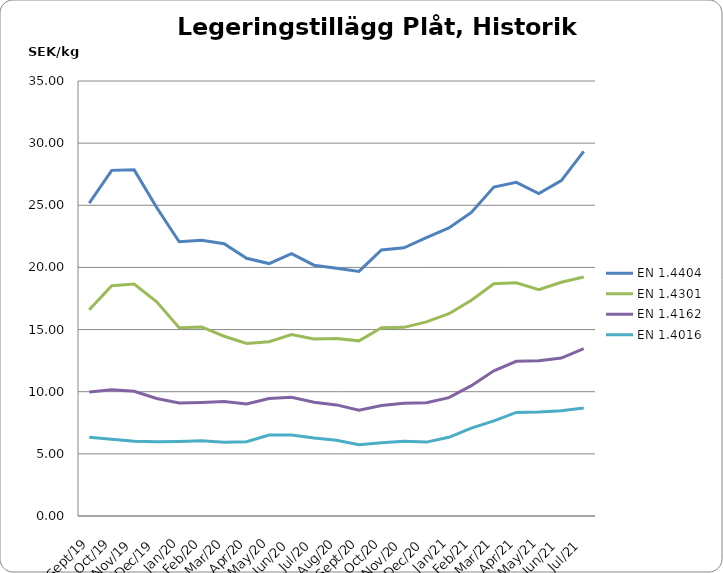
| Category | EN 1.4404 | EN 1.4301 | EN 1.4162  | EN 1.4016 |
|---|---|---|---|---|
| 2019-09-01 | 25.17 | 16.6 | 9.97 | 6.33 |
| 2019-10-01 | 27.81 | 18.52 | 10.16 | 6.18 |
| 2019-11-01 | 27.85 | 18.66 | 10.03 | 6.01 |
| 2019-12-01 | 24.82 | 17.23 | 9.46 | 5.97 |
| 2020-01-01 | 22.07 | 15.14 | 9.09 | 6 |
| 2020-02-01 | 22.19 | 15.21 | 9.13 | 6.05 |
| 2020-03-01 | 21.911 | 14.462 | 9.207 | 5.938 |
| 2020-04-01 | 20.74 | 13.88 | 9.02 | 5.97 |
| 2020-05-01 | 20.311 | 14.022 | 9.455 | 6.515 |
| 2020-06-01 | 21.105 | 14.607 | 9.554 | 6.524 |
| 2020-07-01 | 20.18 | 14.24 | 9.15 | 6.27 |
| 2020-08-01 | 19.932 | 14.286 | 8.939 | 6.099 |
| 2020-09-01 | 19.682 | 14.092 | 8.509 | 5.737 |
| 2020-10-01 | 21.4 | 15.147 | 8.892 | 5.888 |
| 2020-11-01 | 21.582 | 15.177 | 9.062 | 6.011 |
| 2020-12-01 | 22.402 | 15.617 | 9.115 | 5.945 |
| 2021-01-01 | 23.183 | 16.279 | 9.524 | 6.334 |
| 2021-02-01 | 24.425 | 17.354 | 10.488 | 7.077 |
| 2021-03-01 | 26.469 | 18.69 | 11.679 | 7.656 |
| 2021-04-01 | 26.842 | 18.766 | 12.443 | 8.336 |
| 2021-05-01 | 25.936 | 18.21 | 12.499 | 8.373 |
| 2021-06-01 | 26.983 | 18.811 | 12.71 | 8.473 |
| 2021-07-01 | 29.342 | 19.226 | 13.458 | 8.692 |